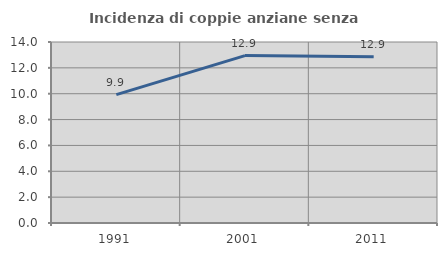
| Category | Incidenza di coppie anziane senza figli  |
|---|---|
| 1991.0 | 9.926 |
| 2001.0 | 12.949 |
| 2011.0 | 12.857 |